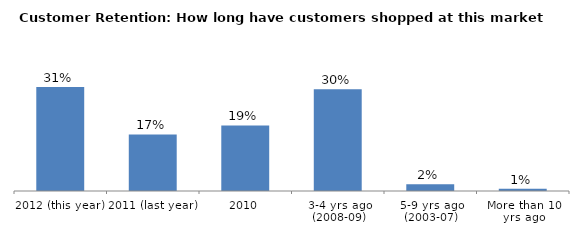
| Category | Series 0 |
|---|---|
| 2012 (this year) | 0.309 |
| 2011 (last year) | 0.168 |
| 2010 | 0.195 |
| 3-4 yrs ago (2008-09) | 0.302 |
| 5-9 yrs ago (2003-07) | 0.02 |
| More than 10 yrs ago | 0.007 |